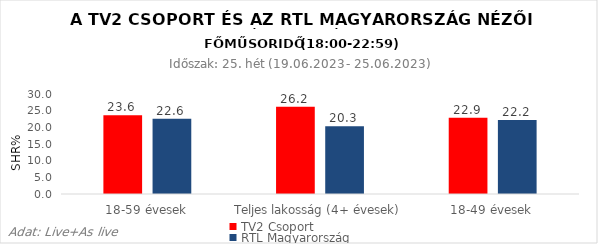
| Category | TV2 Csoport | RTL Magyarország |
|---|---|---|
| 18-59 évesek | 23.6 | 22.6 |
| Teljes lakosság (4+ évesek) | 26.2 | 20.3 |
| 18-49 évesek | 22.9 | 22.2 |